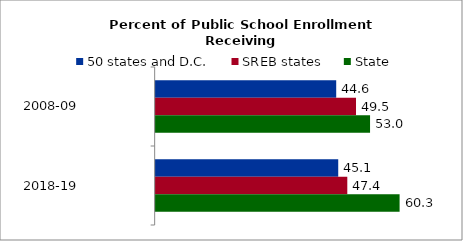
| Category | 50 states and D.C. | SREB states | State |
|---|---|---|---|
| 2008-09 | 44.638 | 49.534 | 53.008 |
| 2018-19 | 45.139 | 47.382 | 60.312 |